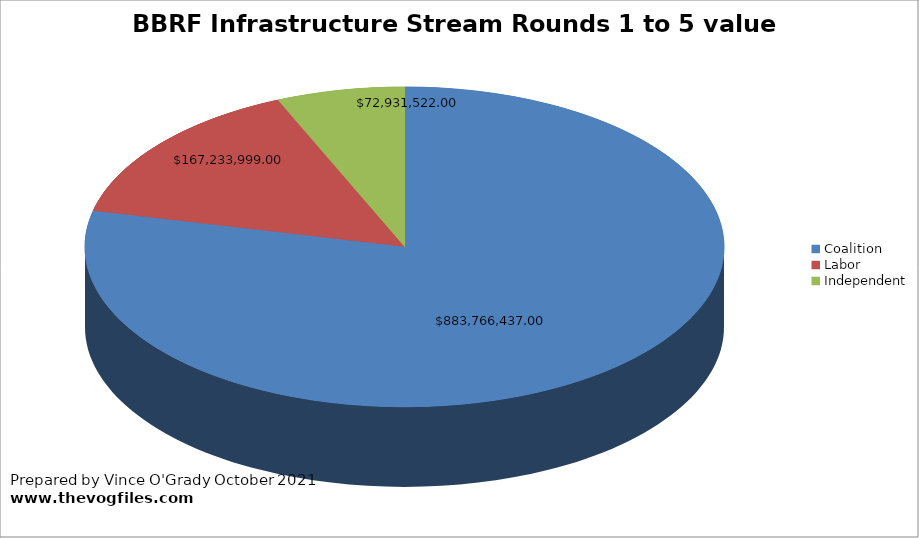
| Category | BBRF Infrastructure Stream Rounds 1 to 5 value $1.123,931,958.00 |
|---|---|
| Coalition | 883766437 |
| Labor | 167233999 |
| Independent | 72931522 |